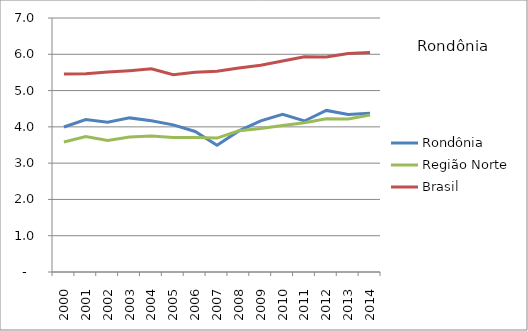
| Category | Rondônia | Região Norte | Brasil |
|---|---|---|---|
| 2000.0 | 3.997 | 3.584 | 5.458 |
| 2001.0 | 4.203 | 3.732 | 5.467 |
| 2002.0 | 4.129 | 3.625 | 5.513 |
| 2003.0 | 4.247 | 3.72 | 5.549 |
| 2004.0 | 4.171 | 3.745 | 5.599 |
| 2005.0 | 4.055 | 3.709 | 5.438 |
| 2006.0 | 3.874 | 3.704 | 5.507 |
| 2007.0 | 3.494 | 3.69 | 5.531 |
| 2008.0 | 3.889 | 3.894 | 5.623 |
| 2009.0 | 4.167 | 3.953 | 5.699 |
| 2010.0 | 4.343 | 4.037 | 5.816 |
| 2011.0 | 4.161 | 4.116 | 5.93 |
| 2012.0 | 4.453 | 4.224 | 5.928 |
| 2013.0 | 4.34 | 4.216 | 6.021 |
| 2014.0 | 4.378 | 4.325 | 6.051 |